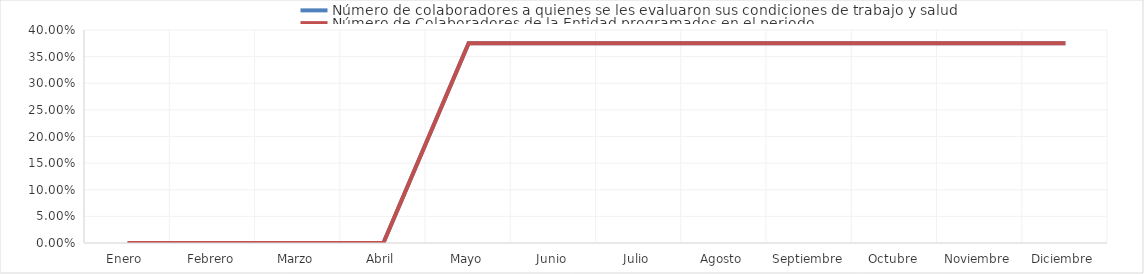
| Category | Número de colaboradores a quienes se les evaluaron sus condiciones de trabajo y salud | Número de Colaboradores de la Entidad programados en el periodo |
|---|---|---|
| Enero  | 0 | 0 |
| Febrero | 0 | 0 |
| Marzo | 0 | 0 |
| Abril | 0 | 0 |
| Mayo | 0.375 | 0.375 |
| Junio | 0.375 | 0.375 |
| Julio | 0.375 | 0.375 |
| Agosto | 0.375 | 0.375 |
| Septiembre | 0.375 | 0.375 |
| Octubre | 0.375 | 0.375 |
| Noviembre | 0.375 | 0.375 |
| Diciembre | 0.375 | 0.375 |